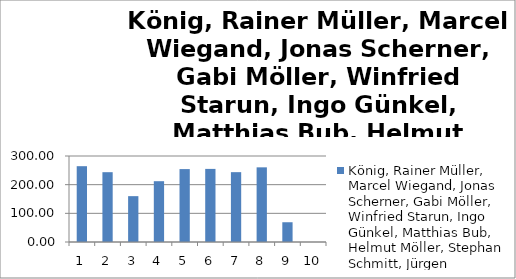
| Category | König, Rainer Müller, Marcel Wiegand, Jonas Scherner, Gabi Möller, Winfried Starun, Ingo Günkel, Matthias Bub, Helmut Möller, Stephan Schmitt, Jürgen |
|---|---|
| 0 | 264.45 |
| 1 | 243.52 |
| 2 | 159.95 |
| 3 | 212.1 |
| 4 | 254.32 |
| 5 | 255.02 |
| 6 | 243.65 |
| 7 | 260.44 |
| 8 | 68.93 |
| 9 | 0 |